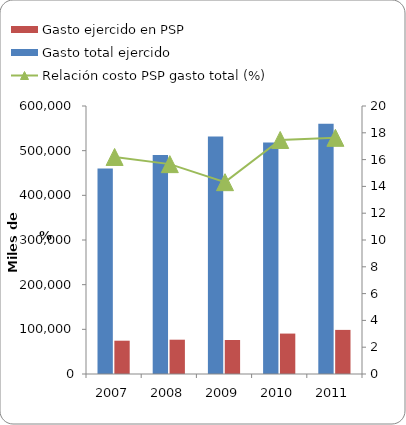
| Category | Gasto total ejercido | Gasto ejercido en PSP |
|---|---|---|
| 2007 | 460217 | 74540 |
| 2008 | 490288 | 76790 |
| 2009 | 531486 | 76086 |
| 2010 | 518241 | 90506 |
| 2011 | 560225 | 98742 |